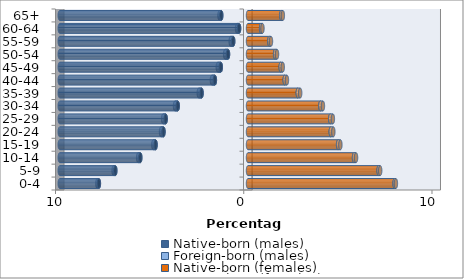
| Category | Native-born (males) | Foreign-born (males) | Native-born (females) | Foreign-born (females) |
|---|---|---|---|---|
| 0-4 | -7.921 | -0.082 | 7.786 | 0.07 |
| 5-9 | -7.049 | -0.091 | 6.939 | 0.084 |
| 10-14 | -5.721 | -0.114 | 5.632 | 0.108 |
| 15-19 | -4.91 | -0.121 | 4.785 | 0.123 |
| 20-24 | -4.489 | -0.131 | 4.395 | 0.138 |
| 25-29 | -4.372 | -0.138 | 4.366 | 0.142 |
| 30-34 | -3.733 | -0.144 | 3.844 | 0.137 |
| 35-39 | -2.465 | -0.15 | 2.644 | 0.127 |
| 40-44 | -1.76 | -0.158 | 1.949 | 0.119 |
| 45-49 | -1.445 | -0.16 | 1.735 | 0.11 |
| 50-54 | -1.061 | -0.153 | 1.439 | 0.103 |
| 55-59 | -0.786 | -0.134 | 1.13 | 0.09 |
| 60-64 | -0.474 | -0.109 | 0.695 | 0.074 |
| 65+ | -1.421 | -0.093 | 1.766 | 0.085 |